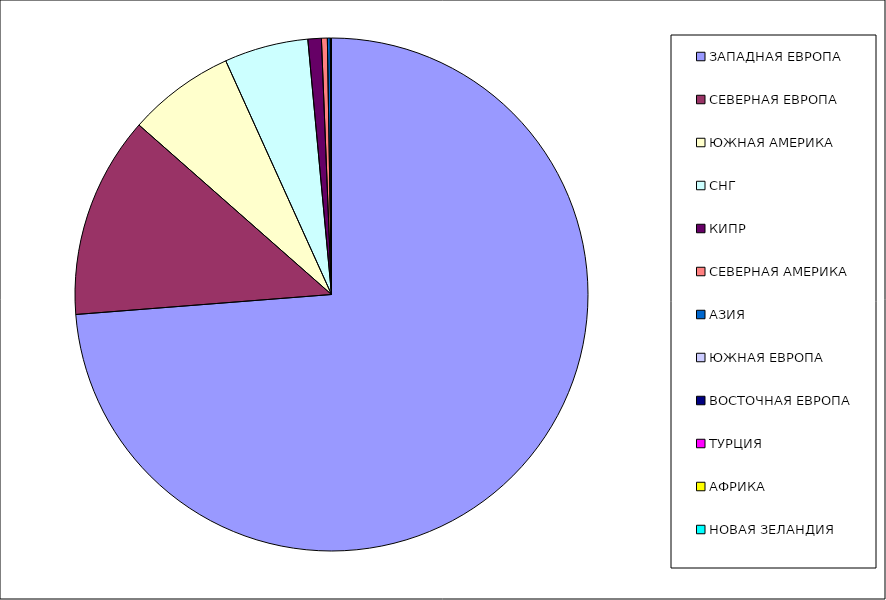
| Category | Оборот |
|---|---|
| ЗАПАДНАЯ ЕВРОПА | 0.738 |
| СЕВЕРНАЯ ЕВРОПА | 0.127 |
| ЮЖНАЯ АМЕРИКА | 0.067 |
| СНГ | 0.053 |
| КИПР | 0.008 |
| СЕВЕРНАЯ АМЕРИКА | 0.004 |
| АЗИЯ | 0.002 |
| ЮЖНАЯ ЕВРОПА | 0 |
| ВОСТОЧНАЯ ЕВРОПА | 0 |
| ТУРЦИЯ | 0 |
| АФРИКА | 0 |
| НОВАЯ ЗЕЛАНДИЯ | 0 |